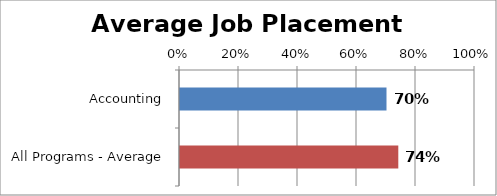
| Category | Series 0 |
|---|---|
| Accounting | 0.7 |
| All Programs - Average | 0.74 |